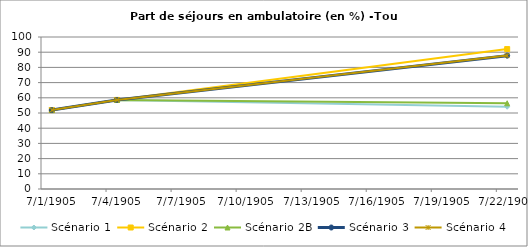
| Category | Scénario 1 | Scénario 2 | Scénario 2B | Scénario 3 | Scénario 4 |
|---|---|---|---|---|---|
| 2009.0 | 51.914 | 51.914 | 51.914 | 51.914 | 51.914 |
| 2012.0 | 58.596 | 58.596 | 58.596 | 58.596 | 58.596 |
| 2030.0 | 54.114 | 92.045 | 56.4 | 87.734 | 87.765 |